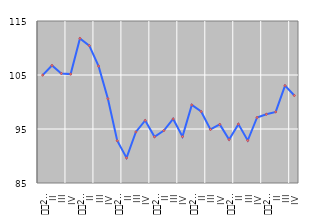
| Category | Индекс индустријске производње |
|---|---|
| I
2007. | 104.979 |
| II | 106.763 |
| III | 105.285 |
| IV | 105.17 |
| I
2008. | 111.776 |
| II | 110.446 |
| III | 106.647 |
| IV | 100.597 |
| I
2009. | 92.832 |
| II | 89.648 |
| III | 94.454 |
| IV | 96.591 |
| I
2010. | 93.552 |
| II | 94.71 |
| III | 96.865 |
| IV | 93.591 |
| I
2011. | 99.451 |
| II | 98.239 |
| III | 94.911 |
| IV | 95.849 |
| I
2012. | 93.041 |
| II | 95.903 |
| III | 92.87 |
| IV | 97.138 |
| I
2013. | 97.733 |
| II | 98.167 |
| III | 103.033 |
| IV | 101.2 |